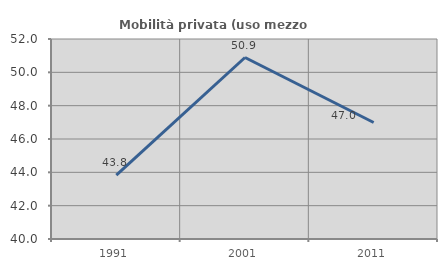
| Category | Mobilità privata (uso mezzo privato) |
|---|---|
| 1991.0 | 43.831 |
| 2001.0 | 50.89 |
| 2011.0 | 46.99 |